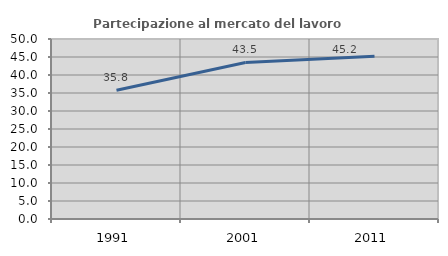
| Category | Partecipazione al mercato del lavoro  femminile |
|---|---|
| 1991.0 | 35.782 |
| 2001.0 | 43.476 |
| 2011.0 | 45.236 |